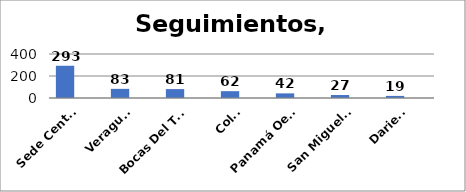
| Category | Series 0 | Series 1 |
|---|---|---|
| Sede Central | 293 |  |
| Veraguas  | 83 |  |
| Bocas Del Toro | 81 |  |
| Colón | 62 |  |
| Panamá Oeste  | 42 |  |
| San Miguelito | 27 |  |
| Darien  | 19 |  |